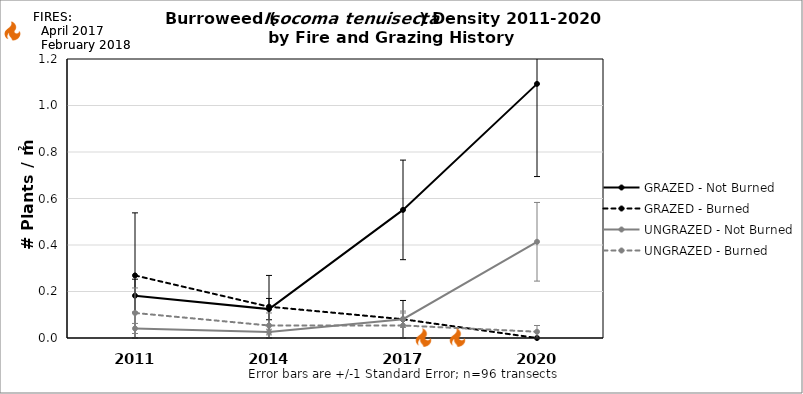
| Category | GRAZED - Not Burned | GRAZED - Burned | UNGRAZED - Not Burned | UNGRAZED - Burned |
|---|---|---|---|---|
| 2011.0 | 0.182 | 0.269 | 0.041 | 0.108 |
| 2014.0 | 0.124 | 0.135 | 0.026 | 0.054 |
| 2017.0 | 0.551 | 0.081 | 0.081 | 0.054 |
| 2020.0 | 1.093 | 0 | 0.414 | 0.027 |